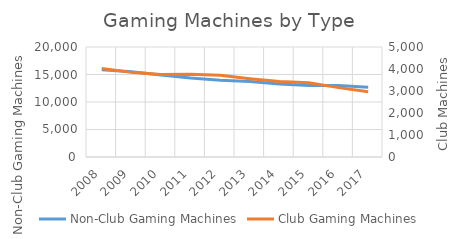
| Category | Non-Club Gaming Machines |
|---|---|
| 2008 | 15857 |
| 2009 | 15512 |
| 2010 | 14926 |
| 2011 | 14377 |
| 2012 | 13957 |
| 2013 | 13707 |
| 2014 | 13289 |
| 2015 | 13016 |
| 2016 | 12995 |
| 2017 | 12667 |